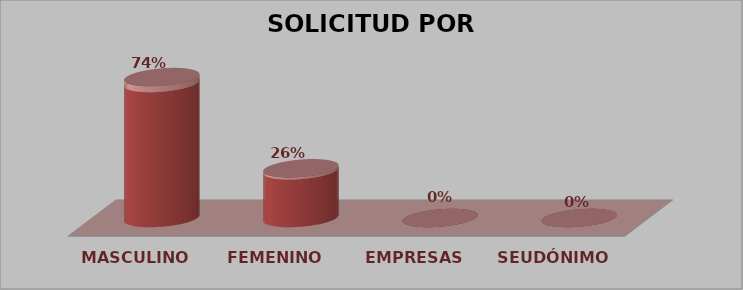
| Category | SOLICITUD POR GÉNERO | Series 1 |
|---|---|---|
| MASCULINO | 17 | 0.739 |
| FEMENINO | 6 | 0.261 |
| EMPRESAS | 0 | 0 |
| SEUDÓNIMO | 0 | 0 |